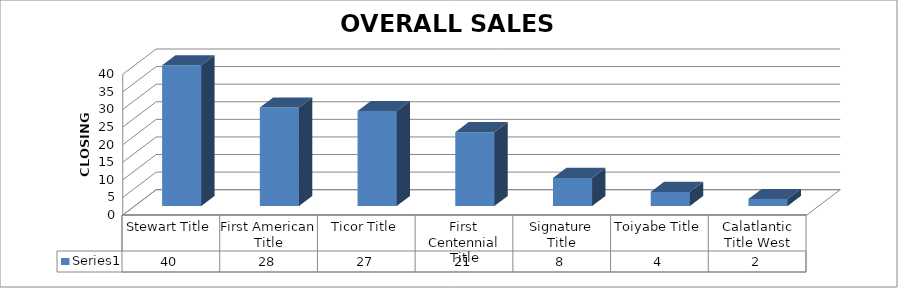
| Category | Series 0 |
|---|---|
| Stewart Title | 40 |
| First American Title | 28 |
| Ticor Title | 27 |
| First Centennial Title | 21 |
| Signature Title | 8 |
| Toiyabe Title | 4 |
| Calatlantic Title West | 2 |